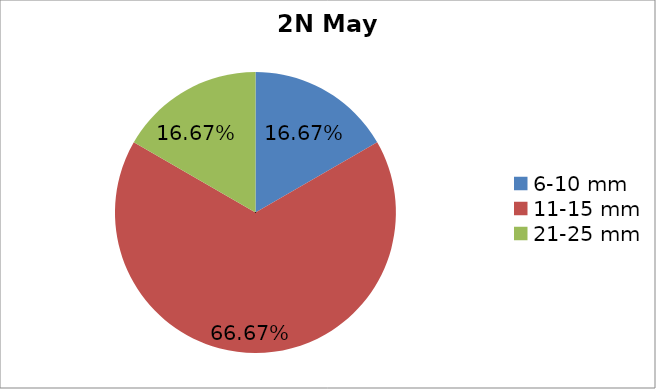
| Category | Series 0 |
|---|---|
| 6-10 mm | 0.167 |
| 11-15 mm | 0.667 |
| 21-25 mm | 0.167 |